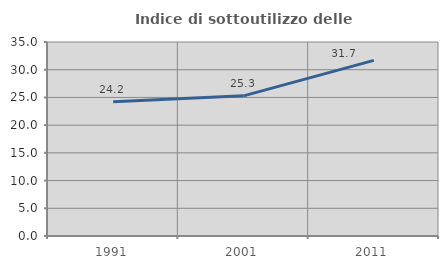
| Category | Indice di sottoutilizzo delle abitazioni  |
|---|---|
| 1991.0 | 24.216 |
| 2001.0 | 25.289 |
| 2011.0 | 31.682 |